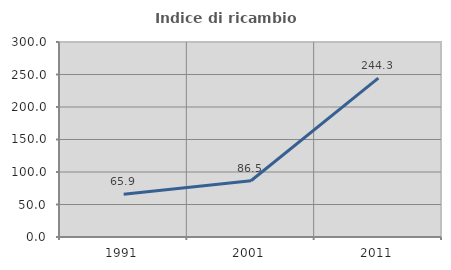
| Category | Indice di ricambio occupazionale  |
|---|---|
| 1991.0 | 65.895 |
| 2001.0 | 86.523 |
| 2011.0 | 244.301 |